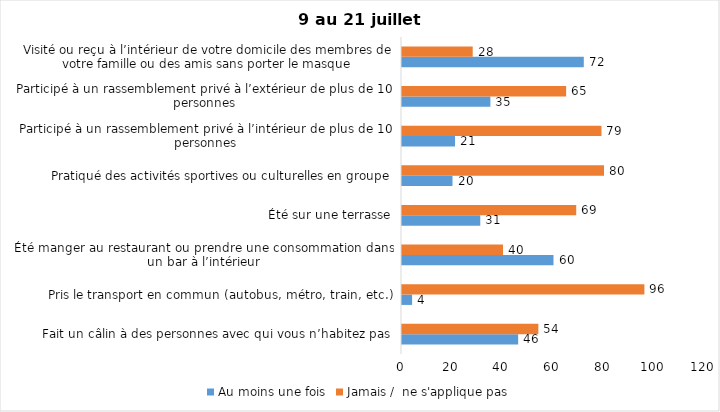
| Category | Au moins une fois | Jamais /  ne s'applique pas |
|---|---|---|
| Fait un câlin à des personnes avec qui vous n’habitez pas | 46 | 54 |
| Pris le transport en commun (autobus, métro, train, etc.) | 4 | 96 |
| Été manger au restaurant ou prendre une consommation dans un bar à l’intérieur | 60 | 40 |
| Été sur une terrasse | 31 | 69 |
| Pratiqué des activités sportives ou culturelles en groupe | 20 | 80 |
| Participé à un rassemblement privé à l’intérieur de plus de 10 personnes | 21 | 79 |
| Participé à un rassemblement privé à l’extérieur de plus de 10 personnes | 35 | 65 |
| Visité ou reçu à l’intérieur de votre domicile des membres de votre famille ou des amis sans porter le masque | 72 | 28 |